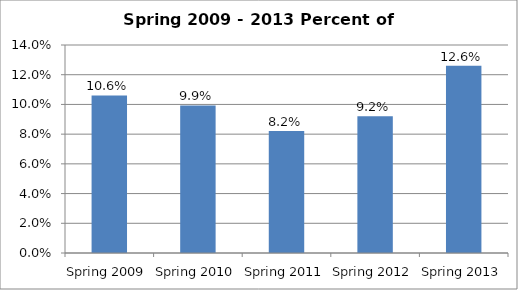
| Category | PercentWithdrawals |
|---|---|
| Spring 2009 | 0.106 |
| Spring 2010 | 0.099 |
| Spring 2011 | 0.082 |
| Spring 2012 | 0.092 |
| Spring 2013 | 0.126 |